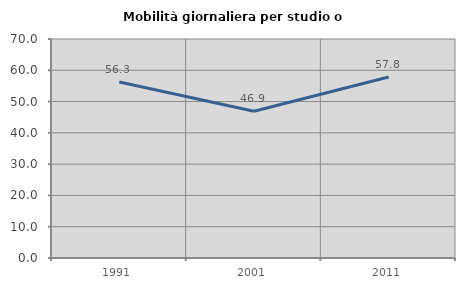
| Category | Mobilità giornaliera per studio o lavoro |
|---|---|
| 1991.0 | 56.25 |
| 2001.0 | 46.914 |
| 2011.0 | 57.831 |